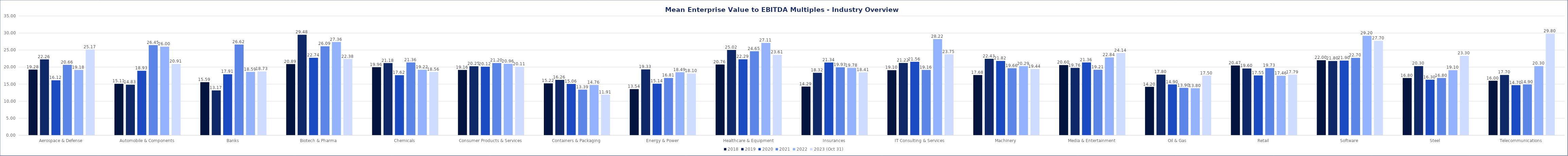
| Category | 2018 | 2019 | 2020 | 2021 | 2022 | 2023 (Oct 31) |
|---|---|---|---|---|---|---|
| Aerospace & Defense | 19.28 | 22.26 | 16.12 | 20.66 | 19.18 | 25.17 |
| Automobile & Components | 15.11 | 14.83 | 18.93 | 26.45 | 26 | 20.91 |
| Banks | 15.59 | 13.17 | 17.91 | 26.62 | 18.59 | 18.73 |
| Biotech & Pharma | 20.89 | 29.48 | 22.74 | 26.09 | 27.36 | 22.38 |
| Chemicals | 19.96 | 21.18 | 17.62 | 21.36 | 19.22 | 18.56 |
| Consumer Products & Services | 19.16 | 20.25 | 20.12 | 21.2 | 20.96 | 20.11 |
| Containers & Packaging | 15.22 | 16.26 | 15.06 | 13.39 | 14.76 | 11.91 |
| Energy & Power | 13.54 | 19.33 | 15.14 | 16.81 | 18.49 | 18.1 |
| Healthcare & Equipment | 20.76 | 25.02 | 22.29 | 24.65 | 27.11 | 23.61 |
| Insurances | 14.29 | 18.32 | 21.34 | 19.93 | 19.78 | 18.41 |
| IT Consulting & Services | 19.1 | 21.22 | 21.56 | 19.16 | 28.22 | 23.75 |
| Machinery | 17.68 | 22.43 | 21.82 | 19.66 | 20.29 | 19.44 |
| Media & Entertainment | 20.6 | 19.76 | 21.36 | 19.21 | 22.84 | 24.14 |
| Oil & Gas | 14.2 | 17.8 | 14.9 | 13.9 | 13.8 | 17.5 |
| Retail | 20.47 | 19.6 | 17.55 | 19.73 | 17.46 | 17.79 |
| Software | 22 | 21.8 | 21.9 | 22.7 | 29.2 | 27.7 |
| Steel | 16.8 | 20.3 | 16.3 | 16.8 | 19.1 | 23.3 |
| Telecommunications | 16 | 17.7 | 14.7 | 14.9 | 20.3 | 29.8 |